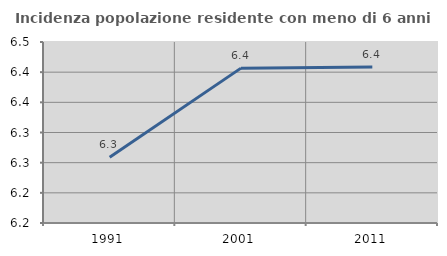
| Category | Incidenza popolazione residente con meno di 6 anni |
|---|---|
| 1991.0 | 6.259 |
| 2001.0 | 6.407 |
| 2011.0 | 6.409 |